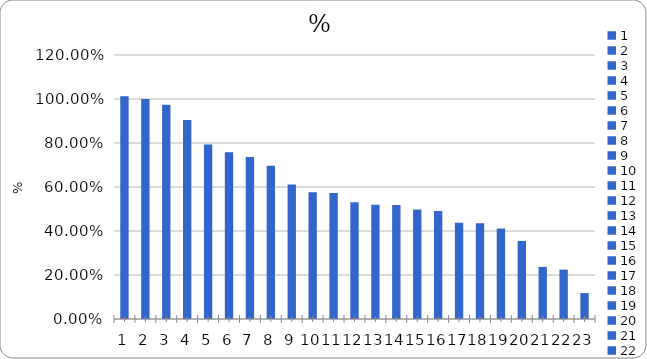
| Category | % |
|---|---|
| 0 | 1.012 |
| 1 | 1 |
| 2 | 0.974 |
| 3 | 0.904 |
| 4 | 0.793 |
| 5 | 0.757 |
| 6 | 0.736 |
| 7 | 0.696 |
| 8 | 0.611 |
| 9 | 0.576 |
| 10 | 0.572 |
| 11 | 0.531 |
| 12 | 0.519 |
| 13 | 0.519 |
| 14 | 0.498 |
| 15 | 0.491 |
| 16 | 0.437 |
| 17 | 0.436 |
| 18 | 0.412 |
| 19 | 0.355 |
| 20 | 0.237 |
| 21 | 0.224 |
| 22 | 0.118 |